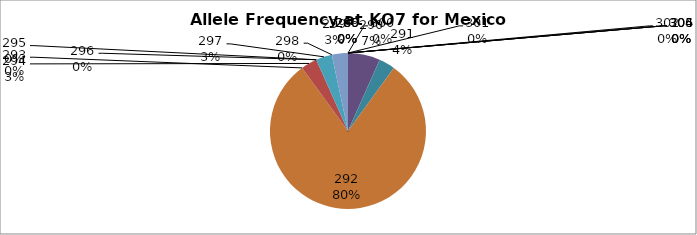
| Category | Series 0 |
|---|---|
| 260.0 | 0 |
| 285.0 | 0 |
| 289.0 | 0 |
| 290.0 | 0.067 |
| 291.0 | 0.033 |
| 292.0 | 0.8 |
| 293.0 | 0 |
| 294.0 | 0.033 |
| 295.0 | 0 |
| 296.0 | 0 |
| 297.0 | 0.033 |
| 298.0 | 0 |
| 299.0 | 0.033 |
| 300.0 | 0 |
| 301.0 | 0 |
| 302.0 | 0 |
| 304.0 | 0 |
| 305.0 | 0 |
| 306.0 | 0 |